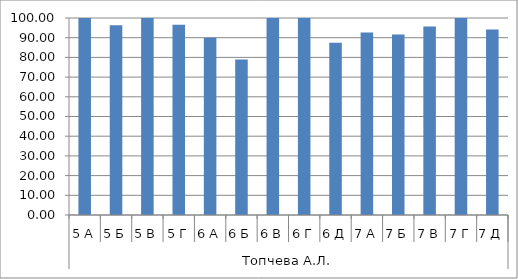
| Category | Series 0 |
|---|---|
| 0 | 100 |
| 1 | 96.296 |
| 2 | 100 |
| 3 | 96.552 |
| 4 | 90 |
| 5 | 78.947 |
| 6 | 100 |
| 7 | 100 |
| 8 | 87.5 |
| 9 | 92.593 |
| 10 | 91.667 |
| 11 | 95.652 |
| 12 | 100 |
| 13 | 94.118 |